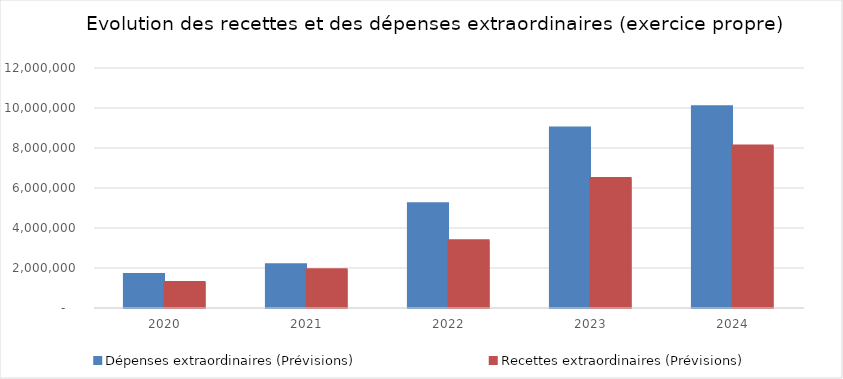
| Category | Dépenses extraordinaires (Prévisions) | Recettes extraordinaires (Prévisions) |
|---|---|---|
| 2020.0 | 1670197.5 | 1273397.6 |
| 2021.0 | 2164547.35 | 1918528.67 |
| 2022.0 | 5210331.95 | 3360086.63 |
| 2023.0 | 9005892.8 | 6475130.33 |
| 2024.0 | 10064639.26 | 8099444.72 |